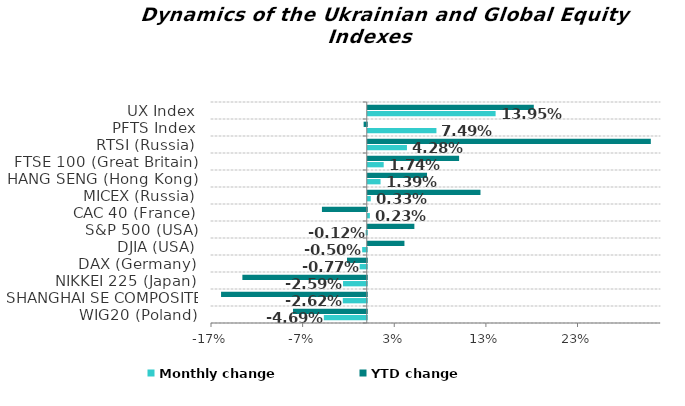
| Category | Monthly change | YTD change |
|---|---|---|
| WIG20 (Poland) | -0.047 | -0.08 |
| SHANGHAI SE COMPOSITE (China) | -0.026 | -0.159 |
| NIKKEI 225 (Japan) | -0.026 | -0.136 |
| DAX (Germany) | -0.008 | -0.022 |
| DJIA (USA) | -0.005 | 0.04 |
| S&P 500 (USA) | -0.001 | 0.051 |
| CAC 40 (France) | 0.002 | -0.049 |
| MICEX (Russia) | 0.003 | 0.123 |
| HANG SENG (Hong Kong) | 0.014 | 0.065 |
| FTSE 100 (Great Britain) | 0.017 | 0.1 |
| RTSI (Russia) | 0.043 | 0.309 |
| PFTS Index | 0.075 | -0.003 |
| UX Index | 0.14 | 0.181 |